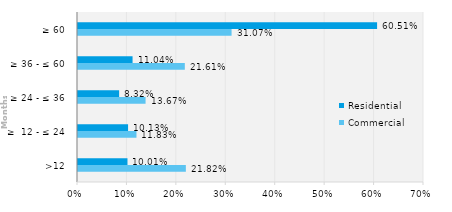
| Category | Commercial | Residential |
|---|---|---|
| >12 | 0.218 | 0.1 |
| ≥  12 - ≤ 24 | 0.118 | 0.101 |
| ≥ 24 - ≤ 36 | 0.137 | 0.083 |
| ≥ 36 - ≤ 60 | 0.216 | 0.11 |
| ≥ 60 | 0.311 | 0.605 |